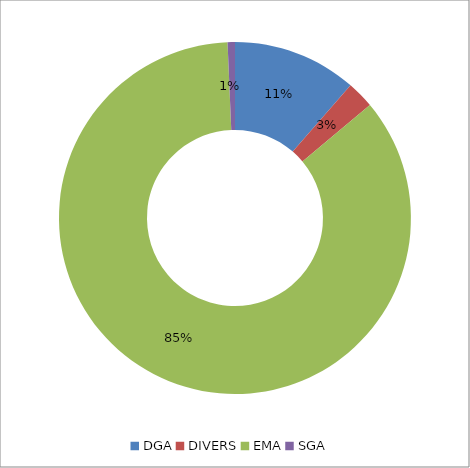
| Category | Series 0 |
|---|---|
| DGA | 0.114 |
| DIVERS | 0.025 |
| EMA | 0.854 |
| SGA | 0.007 |